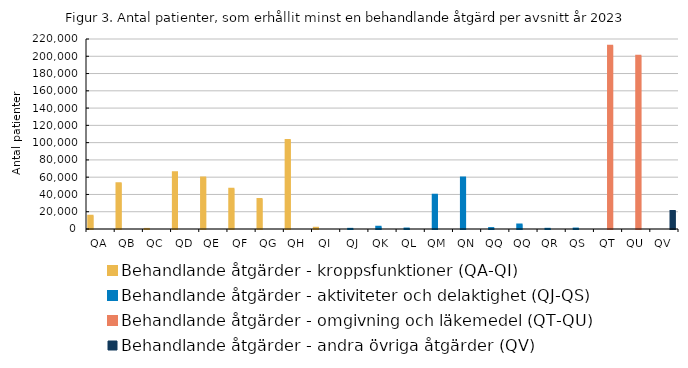
| Category | Behandlande åtgärder - kroppsfunktioner (QA-QI) | Behandlande åtgärder - aktiviteter och delaktighet (QJ-QS) | Behandlande åtgärder - omgivning och läkemedel (QT-QU) | Behandlande åtgärder - andra övriga åtgärder (QV) |
|---|---|---|---|---|
| QA | 15365 | 0 | 0 | 0 |
| QB | 53091 | 0 | 0 | 0 |
| QC | 104 | 0 | 0 | 0 |
| QD | 65839 | 0 | 0 | 0 |
| QE | 59550 | 0 | 0 | 0 |
| QF | 46658 | 0 | 0 | 0 |
| QG | 34632 | 0 | 0 | 0 |
| QH | 102911 | 0 | 0 | 0 |
| QI | 1426 | 0 | 0 | 0 |
| QJ | 0 | 177 | 0 | 0 |
| QK | 0 | 2662 | 0 | 0 |
| QL | 0 | 519 | 0 | 0 |
| QM | 0 | 39693 | 0 | 0 |
| QN | 0 | 59497 | 0 | 0 |
| QQ | 0 | 1050 | 0 | 0 |
| QQ | 0 | 5257 | 0 | 0 |
| QR | 0 | 214 | 0 | 0 |
| QS | 0 | 512 | 0 | 0 |
| QT | 0 | 0 | 212320 | 0 |
| QU | 0 | 0 | 200645 | 0 |
| QV | 0 | 0 | 0 | 20762 |